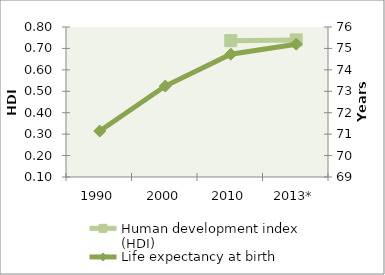
| Category | Human development index (HDI) |
|---|---|
| 1990 | 0 |
| 2000 | 0 |
| 2010 | 0.736 |
| 2013* | 0.74 |